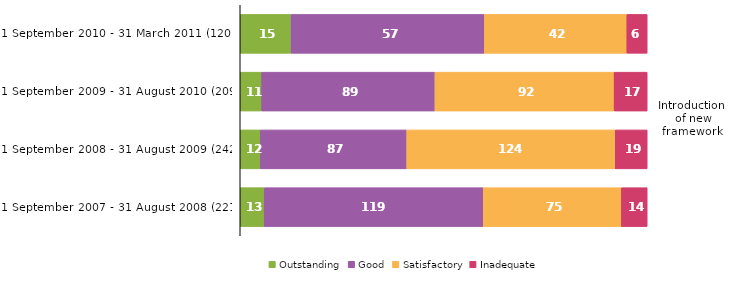
| Category | Outstanding | Good | Satisfactory | Inadequate |
|---|---|---|---|---|
| 1 September 2010 - 31 March 2011 (120)² | 15 | 57 | 42 | 6 |
| 1 September 2009 - 31 August 2010 (209) | 11 | 89 | 92 | 17 |
| 1 September 2008 - 31 August 2009 (242) | 12 | 87 | 124 | 19 |
| 1 September 2007 - 31 August 2008 (221) | 13 | 119 | 75 | 14 |